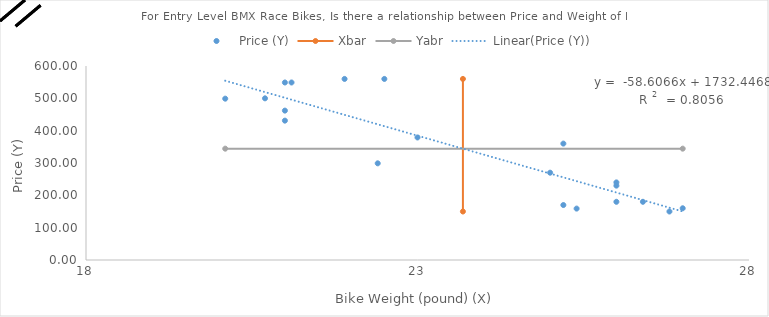
| Category | Price (Y) |
|---|---|
| 22.4 | 299 |
| 21.0 | 462 |
| 21.0 | 549 |
| 26.0 | 180 |
| 21.1 | 549 |
| 26.0 | 240 |
| 26.4 | 180 |
| 21.0 | 431 |
| 25.2 | 360 |
| 26.0 | 230 |
| 25.0 | 270 |
| 26.8 | 150 |
| 25.2 | 170 |
| 27.0 | 160 |
| 25.4 | 159 |
| 20.7 | 500 |
| 21.9 | 560 |
| 22.5 | 560 |
| 20.1 | 499 |
| 23.0 | 379 |